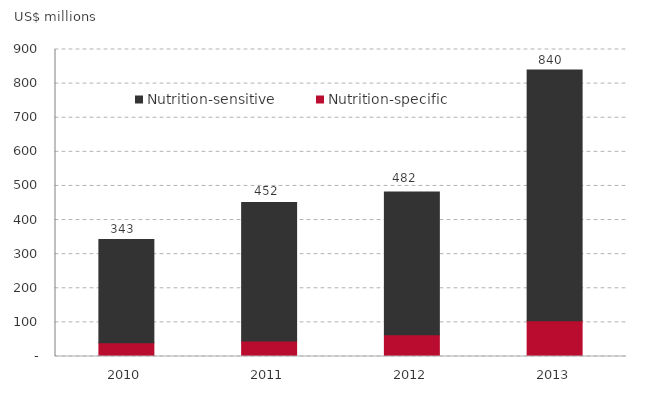
| Category | Nutrition-specific | Nutrition-sensitive |
|---|---|---|
| 2010.0 | 39.984 | 303.191 |
| 2011.0 | 45.22 | 406.464 |
| 2012.0 | 63.926 | 417.966 |
| 2013.0 | 105 | 734.694 |